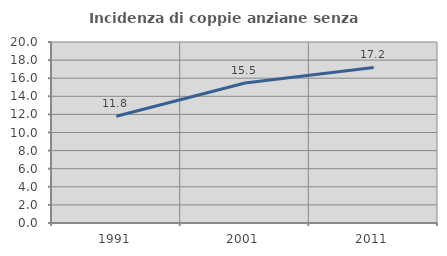
| Category | Incidenza di coppie anziane senza figli  |
|---|---|
| 1991.0 | 11.794 |
| 2001.0 | 15.473 |
| 2011.0 | 17.193 |